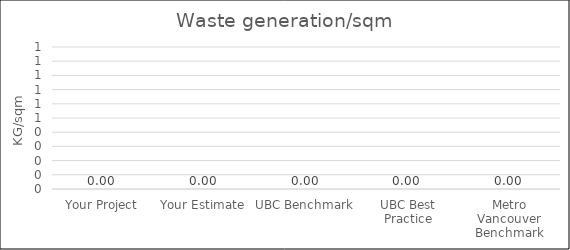
| Category | Waste generation/sqm |
|---|---|
| Your Project | 0 |
| Your Estimate | 0 |
| UBC Benchmark | 0 |
| UBC Best Practice | 0 |
| Metro Vancouver Benchmark | 0 |